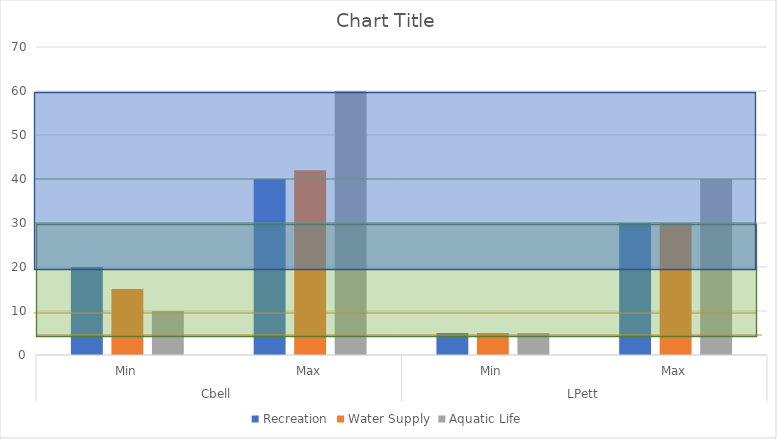
| Category | Recreation | Water Supply | Aquatic Life |
|---|---|---|---|
| 0 | 20 | 15 | 10 |
| 1 | 40 | 42 | 60 |
| 2 | 5 | 5 | 5 |
| 3 | 30 | 30 | 40 |